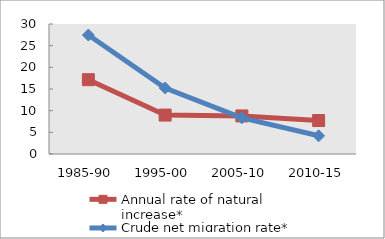
| Category | Annual rate of natural increase* | Crude net migration rate* |
|---|---|---|
| 1985-90 | 17.151 | 27.447 |
| 1995-00 | 8.986 | 15.231 |
| 2005-10 | 8.787 | 8.347 |
| 2010-15 | 7.723 | 4.2 |